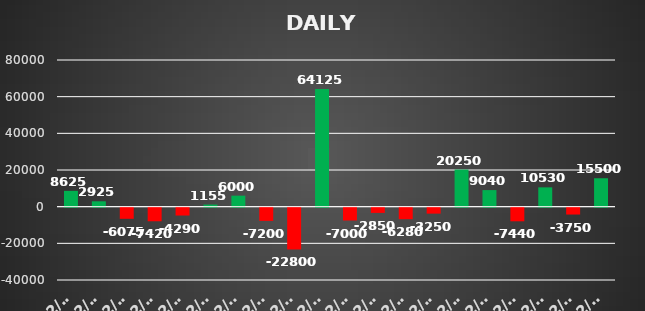
| Category | Series 0 |
|---|---|
| 2022-02-01 | 8625 |
| 2022-02-02 | 2925 |
| 2022-02-03 | -6075 |
| 2022-02-04 | -7420 |
| 2022-02-07 | -4290 |
| 2022-02-08 | 1155 |
| 2022-02-08 | 6000 |
| 2022-02-09 | -7200 |
| 2022-02-10 | -22800 |
| 2022-02-11 | 64125 |
| 2022-02-14 | -7000 |
| 2022-02-15 | -2850 |
| 2022-02-16 | -6280 |
| 2022-02-17 | -3250 |
| 2022-02-18 | 20250 |
| 2022-02-21 | 9040 |
| 2022-02-23 | -7440 |
| 2022-02-24 | 10530 |
| 2022-02-25 | -3750 |
| 2022-02-28 | 15500 |